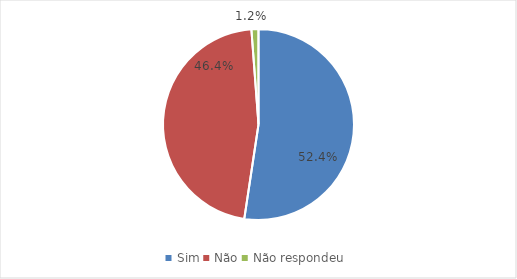
| Category | Series 0 |
|---|---|
| Sim | 44 |
| Não | 39 |
| Não respondeu | 1 |